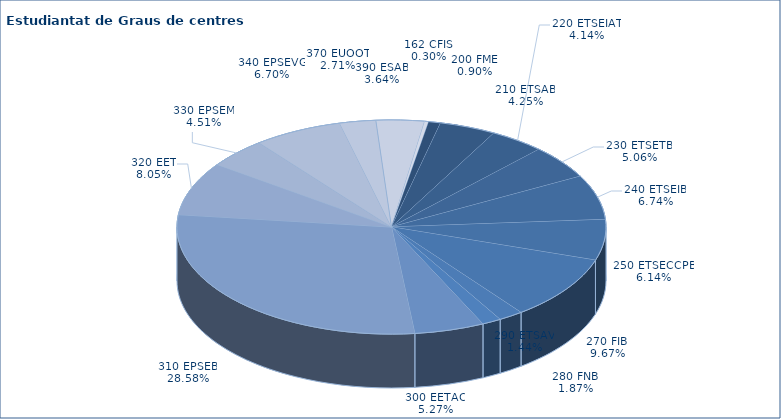
| Category | Series 0 |
|---|---|
| 200 FME | 81 |
| 210 ETSAB | 380 |
| 220 ETSEIAT | 371 |
| 230 ETSETB | 453 |
| 240 ETSEIB | 603 |
| 250 ETSECCPB | 550 |
| 270 FIB | 866 |
| 280 FNB | 167 |
| 290 ETSAV | 129 |
| 300 EETAC | 472 |
| 310 EPSEB | 2558 |
| 320 EET | 721 |
| 330 EPSEM | 404 |
| 340 EPSEVG | 600 |
| 370 EUOOT | 243 |
| 390 ESAB | 326 |
| 162 CFIS | 27 |